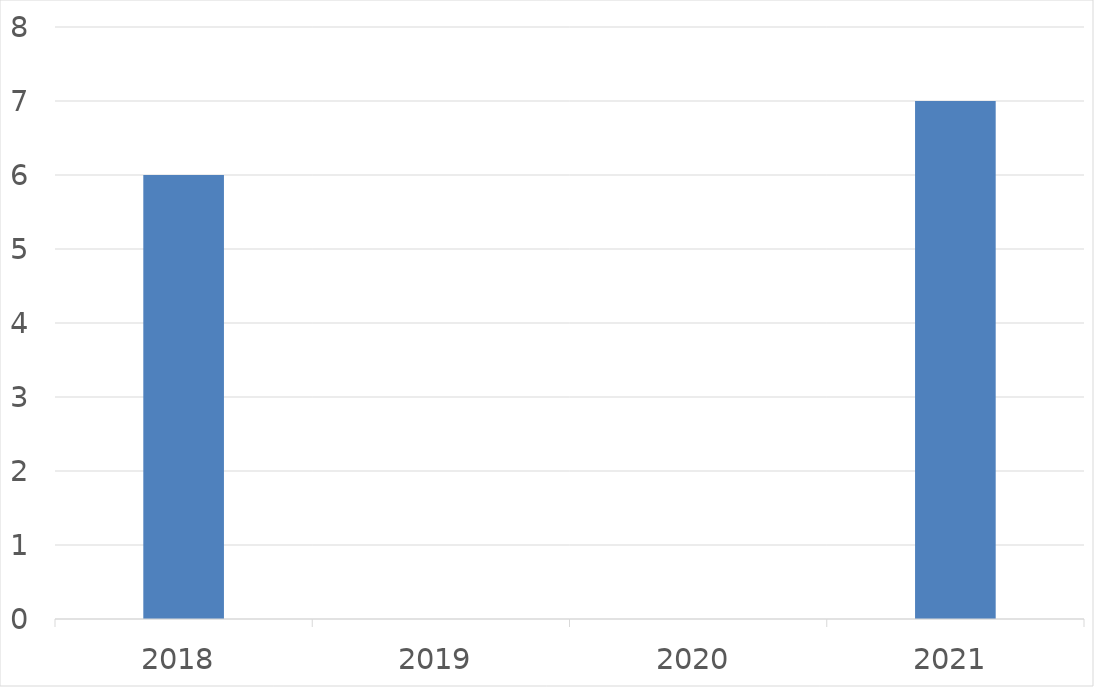
| Category | Series 0 |
|---|---|
| 2018 | 6 |
| 2019 | 0 |
| 2020 | 0 |
| 2021 | 7 |